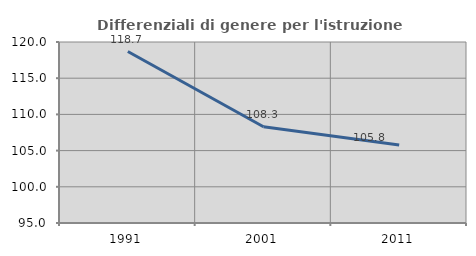
| Category | Differenziali di genere per l'istruzione superiore |
|---|---|
| 1991.0 | 118.683 |
| 2001.0 | 108.288 |
| 2011.0 | 105.777 |